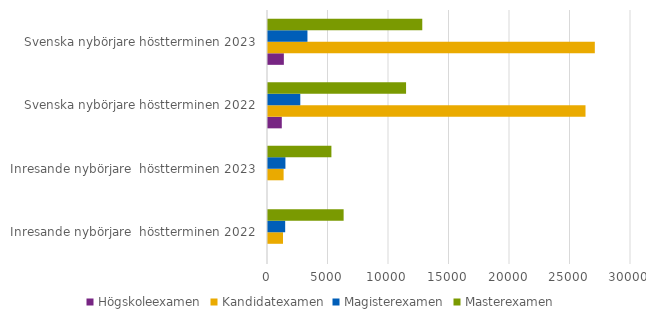
| Category | Högskoleexamen | Kandidatexamen | Magisterexamen | Masterexamen |
|---|---|---|---|---|
| Inresande nybörjare  höstterminen 2022 | 0 | 1240 | 1420 | 6250 |
| Inresande nybörjare  höstterminen 2023 | 0 | 1290 | 1440 | 5240 |
| Svenska nybörjare höstterminen 2022 | 1140 | 26240 | 2670 | 11410 |
| Svenska nybörjare höstterminen 2023 | 1310 | 27010 | 3260 | 12750 |